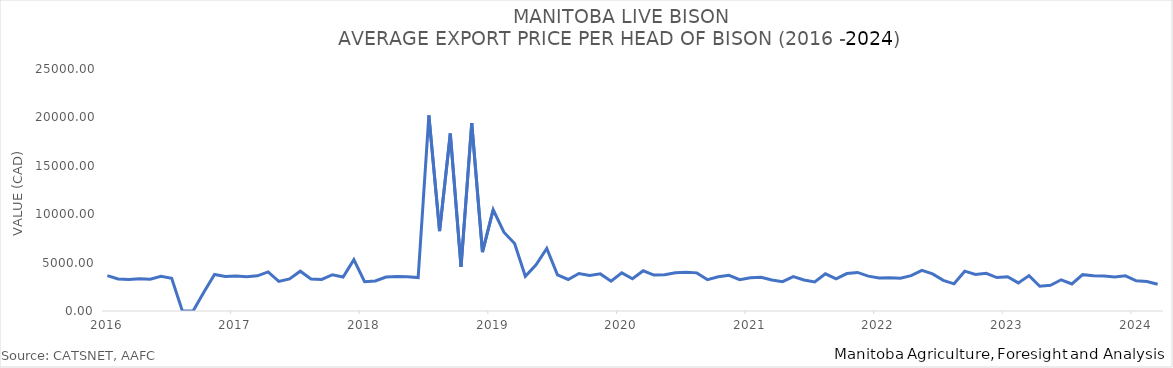
| Category | Total Bison P |
|---|---|
| 2016-01-01 | 3656.327 |
| 2016-02-01 | 3308.762 |
| 2016-03-01 | 3246.713 |
| 2016-04-01 | 3340.286 |
| 2016-05-01 | 3284.748 |
| 2016-06-01 | 3590.55 |
| 2016-07-01 | 3374.325 |
| 2016-08-01 | 0 |
| 2016-09-01 | 0 |
| 2016-10-01 | 1946.772 |
| 2016-11-01 | 3776.1 |
| 2016-12-01 | 3556.545 |
| 2017-01-01 | 3620.321 |
| 2017-02-01 | 3545.74 |
| 2017-03-01 | 3634.804 |
| 2017-04-01 | 4036.429 |
| 2017-05-01 | 3055.983 |
| 2017-06-01 | 3320.851 |
| 2017-07-01 | 4114.333 |
| 2017-08-01 | 3314.513 |
| 2017-09-01 | 3257.795 |
| 2017-10-01 | 3745.364 |
| 2017-11-01 | 3516.113 |
| 2017-12-01 | 5307.685 |
| 2018-01-01 | 3027.264 |
| 2018-02-01 | 3102.589 |
| 2018-03-01 | 3511.13 |
| 2018-04-01 | 3551.682 |
| 2018-05-01 | 3546.936 |
| 2018-06-01 | 3458.264 |
| 2018-07-01 | 20208.662 |
| 2018-08-01 | 8256.663 |
| 2018-09-01 | 18335.06 |
| 2018-10-01 | 4564.124 |
| 2018-11-01 | 19405.549 |
| 2018-12-01 | 6091.963 |
| 2019-01-01 | 10459.255 |
| 2019-02-01 | 8139.589 |
| 2019-03-01 | 6975.792 |
| 2019-04-01 | 3585.418 |
| 2019-05-01 | 4773.394 |
| 2019-06-01 | 6467.154 |
| 2019-07-01 | 3726.427 |
| 2019-08-01 | 3257.196 |
| 2019-09-01 | 3870.904 |
| 2019-10-01 | 3679.116 |
| 2019-11-01 | 3834.212 |
| 2019-12-01 | 3081.586 |
| 2020-01-01 | 3936.244 |
| 2020-02-01 | 3334.266 |
| 2020-03-01 | 4152.873 |
| 2020-04-01 | 3708.058 |
| 2020-05-01 | 3735.949 |
| 2020-06-01 | 3939.885 |
| 2020-07-01 | 4001.365 |
| 2020-08-01 | 3939.396 |
| 2020-09-01 | 3234.59 |
| 2020-10-01 | 3530.7 |
| 2020-11-01 | 3679.106 |
| 2020-12-01 | 3242.192 |
| 2021-01-01 | 3423.275 |
| 2021-02-01 | 3475.3 |
| 2021-03-01 | 3204.295 |
| 2021-04-01 | 3029.117 |
| 2021-05-01 | 3551.688 |
| 2021-06-01 | 3201.92 |
| 2021-07-01 | 2993.563 |
| 2021-08-01 | 3845.175 |
| 2021-09-01 | 3317.864 |
| 2021-10-01 | 3869.498 |
| 2021-11-01 | 3983.125 |
| 2021-12-01 | 3602.568 |
| 2022-01-01 | 3400.777 |
| 2022-02-01 | 3441.513 |
| 2022-03-01 | 3384.188 |
| 2022-04-01 | 3651.183 |
| 2022-05-01 | 4190.444 |
| 2022-06-01 | 3832.328 |
| 2022-07-01 | 3164.112 |
| 2022-08-01 | 2808.77 |
| 2022-09-01 | 4112.897 |
| 2022-10-01 | 3780.099 |
| 2022-11-01 | 3892.312 |
| 2022-12-01 | 3457.602 |
| 2023-01-01 | 3538.361 |
| 2023-02-01 | 2902.767 |
| 2023-03-01 | 3656.747 |
| 2023-04-01 | 2561.658 |
| 2023-05-01 | 2657.991 |
| 2023-06-01 | 3225.118 |
| 2023-07-01 | 2798.455 |
| 2023-08-01 | 3753.28 |
| 2023-09-01 | 3640.414 |
| 2023-10-01 | 3618.794 |
| 2023-11-01 | 3504.75 |
| 2023-12-01 | 3628.253 |
| 2024-01-01 | 3120.407 |
| 2024-02-01 | 3052.286 |
| 2024-03-01 | 2764.483 |